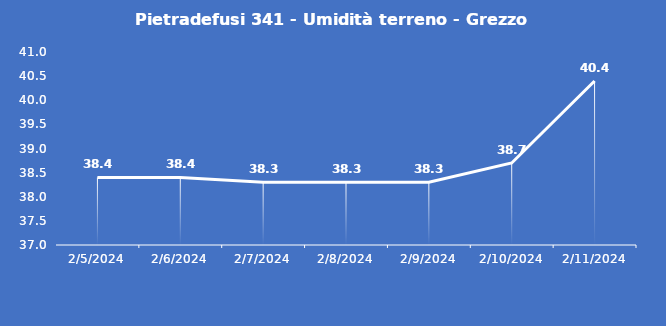
| Category | Pietradefusi 341 - Umidità terreno - Grezzo (%VWC) |
|---|---|
| 2/5/24 | 38.4 |
| 2/6/24 | 38.4 |
| 2/7/24 | 38.3 |
| 2/8/24 | 38.3 |
| 2/9/24 | 38.3 |
| 2/10/24 | 38.7 |
| 2/11/24 | 40.4 |